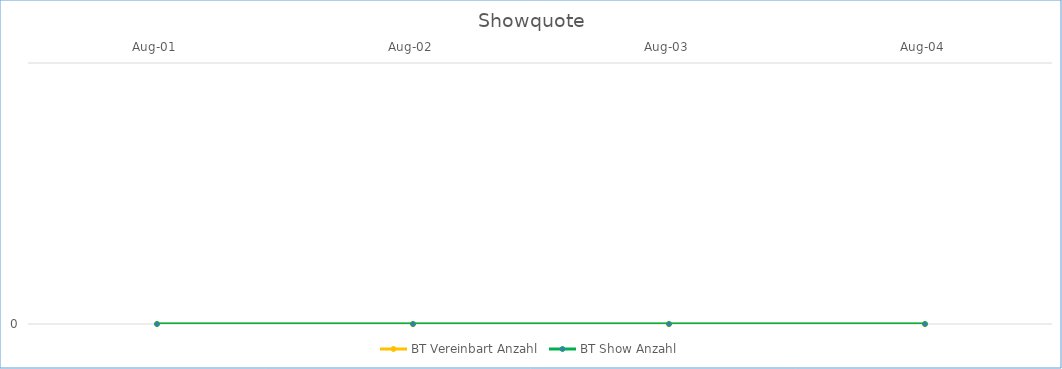
| Category | BT Vereinbart Anzahl | BT Show Anzahl |
|---|---|---|
| 2001-08-01 | 0 | 0 |
| 2002-08-01 | 0 | 0 |
| 2003-08-01 | 0 | 0 |
| 2004-08-01 | 0 | 0 |